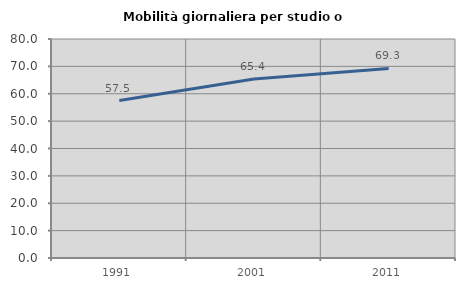
| Category | Mobilità giornaliera per studio o lavoro |
|---|---|
| 1991.0 | 57.527 |
| 2001.0 | 65.353 |
| 2011.0 | 69.26 |